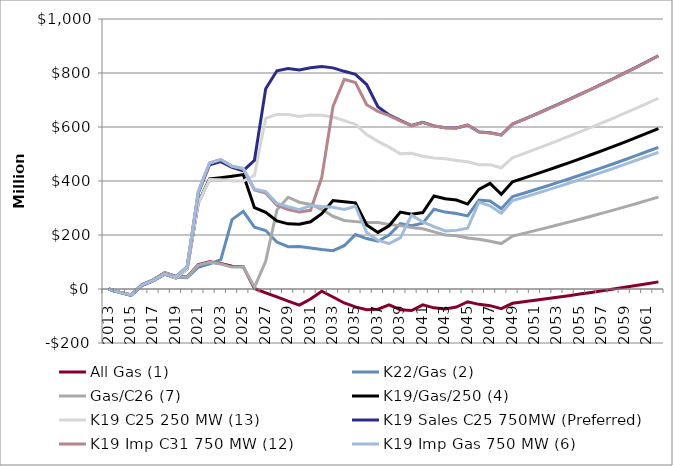
| Category | All Gas (1) | K22/Gas (2) | Gas/C26 (7) | K19/Gas/250 (4) | K19 C25 250 MW (13) | K19 Sales C25 750MW (Preferred) | K19 Imp C31 750 MW (12) | K19 Imp Gas 750 MW (6) |
|---|---|---|---|---|---|---|---|---|
| 2013.0 | 0 | 0 | 0 | 0 | 0 | 0 | 0 | 0 |
| 2014.0 | -12.5 | -12.5 | -12.5 | -12.5 | -12.5 | -12.5 | -12.5 | -12.5 |
| 2015.0 | -21.79 | -21.79 | -21.79 | -22.53 | -22.53 | -23.52 | -22.53 | -22.53 |
| 2016.0 | 16.99 | 16.98 | 16.99 | 15.07 | 15.07 | 13.06 | 15.07 | 15.07 |
| 2017.0 | 34.19 | 33.77 | 34.19 | 32.2 | 32.2 | 30.97 | 32.2 | 32.2 |
| 2018.0 | 60.83 | 59.76 | 60.83 | 55.33 | 54.9 | 54.65 | 55.33 | 55.33 |
| 2019.0 | 46.41 | 44.2 | 45.96 | 40.83 | 40.24 | 45.4 | 44.78 | 44.78 |
| 2020.0 | 44.26 | 41.92 | 43.53 | 74.42 | 73.44 | 82.25 | 81.69 | 81.69 |
| 2021.0 | 90.29 | 80.68 | 88.92 | 320.19 | 318.48 | 356.34 | 361.72 | 361.72 |
| 2022.0 | 100.49 | 93 | 99.31 | 407.9 | 405.09 | 460.37 | 466.68 | 466.68 |
| 2023.0 | 94.34 | 108.99 | 92.71 | 412.49 | 404.96 | 472 | 479.56 | 479.49 |
| 2024.0 | 84.7 | 257.23 | 81.08 | 417.78 | 399.88 | 450.98 | 454.36 | 454.99 |
| 2025.0 | 82.66 | 287.4 | 82.64 | 423.82 | 399.56 | 438.13 | 445.44 | 446.5 |
| 2026.0 | 1.91 | 229.11 | 6.95 | 301.37 | 420.85 | 476.56 | 366.69 | 369.39 |
| 2027.0 | -14.03 | 216.51 | 102.68 | 283.64 | 632.32 | 741.71 | 355.65 | 360.99 |
| 2028.0 | -29.24 | 173.79 | 293.15 | 252.27 | 646.47 | 808.26 | 310.38 | 317.23 |
| 2029.0 | -45.08 | 156.51 | 339.91 | 241.21 | 646.35 | 816.63 | 294.39 | 304.79 |
| 2030.0 | -59.77 | 157.17 | 321.48 | 239.54 | 638.92 | 811.01 | 285.29 | 293.88 |
| 2031.0 | -37.22 | 152.2 | 313.01 | 248.9 | 644.34 | 819.16 | 291.44 | 308.8 |
| 2032.0 | -8.19 | 145.93 | 295.05 | 279.01 | 643.63 | 823.61 | 413.01 | 305.19 |
| 2033.0 | -29.6 | 141.99 | 269.37 | 327.41 | 637.05 | 818.96 | 676.27 | 302.7 |
| 2034.0 | -51.83 | 160.34 | 254.01 | 322.8 | 623.4 | 806.24 | 776.39 | 294.53 |
| 2035.0 | -66.21 | 201.55 | 249.56 | 319.07 | 610.01 | 794.71 | 764.53 | 306.57 |
| 2036.0 | -76.99 | 186.83 | 245.92 | 237.13 | 571.63 | 757.24 | 682.23 | 209.03 |
| 2037.0 | -74.7 | 176.79 | 246.13 | 209.6 | 546.8 | 675.01 | 657.99 | 180.86 |
| 2038.0 | -59.01 | 199.66 | 239.15 | 234.12 | 525.31 | 644.86 | 642.25 | 168.1 |
| 2039.0 | -76.84 | 242.25 | 234.74 | 285.08 | 500.5 | 624.29 | 622.5 | 189.25 |
| 2040.0 | -79.73 | 234.25 | 228.11 | 277.37 | 502.81 | 605.4 | 604.9 | 273.32 |
| 2041.0 | -58.92 | 244.12 | 223.39 | 283.28 | 491.43 | 617.26 | 616.36 | 248.11 |
| 2042.0 | -69.81 | 295.53 | 211.62 | 344.65 | 484.93 | 604.1 | 603.45 | 230.91 |
| 2043.0 | -74.09 | 284.8 | 200.03 | 334.16 | 482.09 | 597.43 | 597.04 | 215.18 |
| 2044.0 | -66.88 | 279.44 | 197.19 | 329.29 | 476.09 | 596.75 | 595.97 | 217.11 |
| 2045.0 | -47.25 | 270.76 | 189.03 | 314.66 | 471 | 607.44 | 606.92 | 224.9 |
| 2046.0 | -56.9 | 329.36 | 184.14 | 368.85 | 460.58 | 581.91 | 581.56 | 321.51 |
| 2047.0 | -61.7 | 325.72 | 177.05 | 391.44 | 460.19 | 578.39 | 577.79 | 308.12 |
| 2048.0 | -72.8 | 297.29 | 168.26 | 350.94 | 449.13 | 570.68 | 570.11 | 280.38 |
| 2049.0 | -53.02 | 342.22 | 196.02 | 397.02 | 486.35 | 611.09 | 610.57 | 327.65 |
| 2050.0 | -47.55 | 354.81 | 205.97 | 410.59 | 501.53 | 628.52 | 627.98 | 339.97 |
| 2051.0 | -41.98 | 367.62 | 216.11 | 424.41 | 516.98 | 646.26 | 645.71 | 352.52 |
| 2052.0 | -36.31 | 380.66 | 226.42 | 438.47 | 532.71 | 664.32 | 663.76 | 365.29 |
| 2053.0 | -30.54 | 393.94 | 236.92 | 452.79 | 548.72 | 682.7 | 682.13 | 378.29 |
| 2054.0 | -24.66 | 407.46 | 247.61 | 467.37 | 565.03 | 701.41 | 700.84 | 391.52 |
| 2055.0 | -18.68 | 421.22 | 258.5 | 482.21 | 581.62 | 720.46 | 719.88 | 405 |
| 2056.0 | -12.59 | 435.23 | 269.58 | 497.31 | 598.52 | 739.86 | 739.26 | 418.71 |
| 2057.0 | -6.39 | 449.49 | 280.85 | 512.69 | 615.72 | 759.6 | 758.99 | 432.67 |
| 2058.0 | -0.08 | 464 | 292.33 | 528.34 | 633.23 | 779.7 | 779.08 | 446.89 |
| 2059.0 | 6.34 | 478.78 | 304.02 | 544.28 | 651.05 | 800.16 | 799.53 | 461.36 |
| 2060.0 | 12.88 | 493.82 | 315.92 | 560.5 | 669.19 | 820.99 | 820.35 | 476.09 |
| 2061.0 | 19.54 | 509.14 | 328.03 | 577.02 | 687.67 | 842.19 | 841.54 | 491.08 |
| 2062.0 | 26.32 | 524.73 | 340.36 | 593.83 | 706.47 | 863.78 | 863.11 | 506.35 |